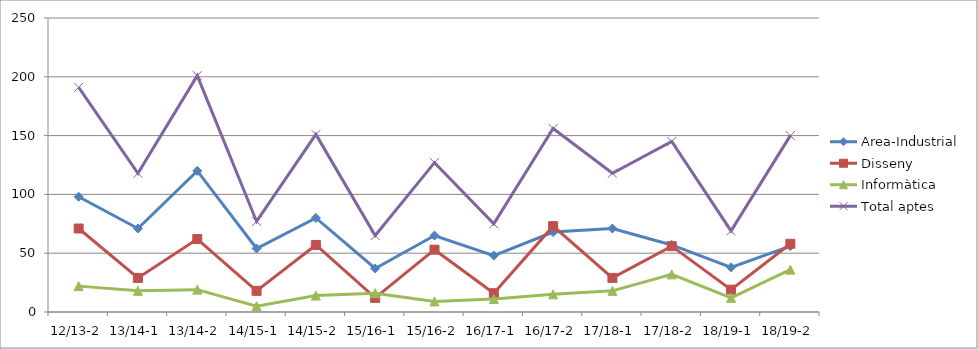
| Category | Area-Industrial | Disseny | Informàtica | Total aptes |
|---|---|---|---|---|
| 12/13-2 | 98 | 71 | 22 | 191 |
| 13/14-1 | 71 | 29 | 18 | 118 |
| 13/14-2 | 120 | 62 | 19 | 201 |
| 14/15-1 | 54 | 18 | 5 | 77 |
| 14/15-2 | 80 | 57 | 14 | 151 |
| 15/16-1 | 37 | 12 | 16 | 65 |
| 15/16-2 | 65 | 53 | 9 | 127 |
| 16/17-1 | 48 | 16 | 11 | 75 |
| 16/17-2 | 68 | 73 | 15 | 156 |
| 17/18-1 | 71 | 29 | 18 | 118 |
| 17/18-2 | 57 | 56 | 32 | 145 |
| 18/19-1 | 38 | 19 | 12 | 69 |
| 18/19-2 | 56 | 58 | 36 | 150 |